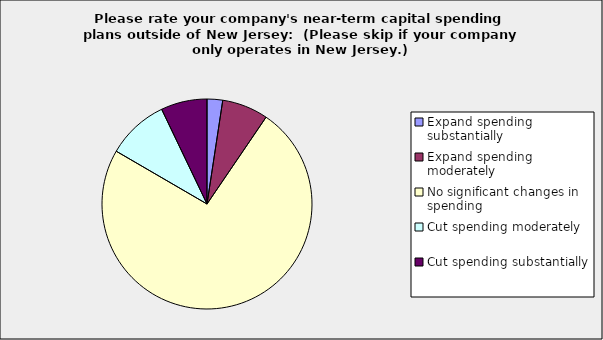
| Category | Series 0 |
|---|---|
| Expand spending substantially | 0.024 |
| Expand spending moderately | 0.071 |
| No significant changes in spending | 0.738 |
| Cut spending moderately | 0.095 |
| Cut spending substantially | 0.071 |